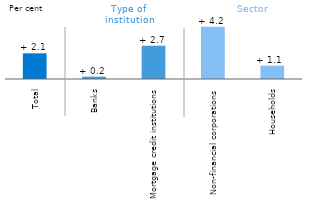
| Category | 201803 |
|---|---|
| Total | 2.07 |
| Banks | 0.188 |
| Mortgage credit institutions | 2.682 |
| Non-financial corporations | 4.219 |
| Households | 1.076 |